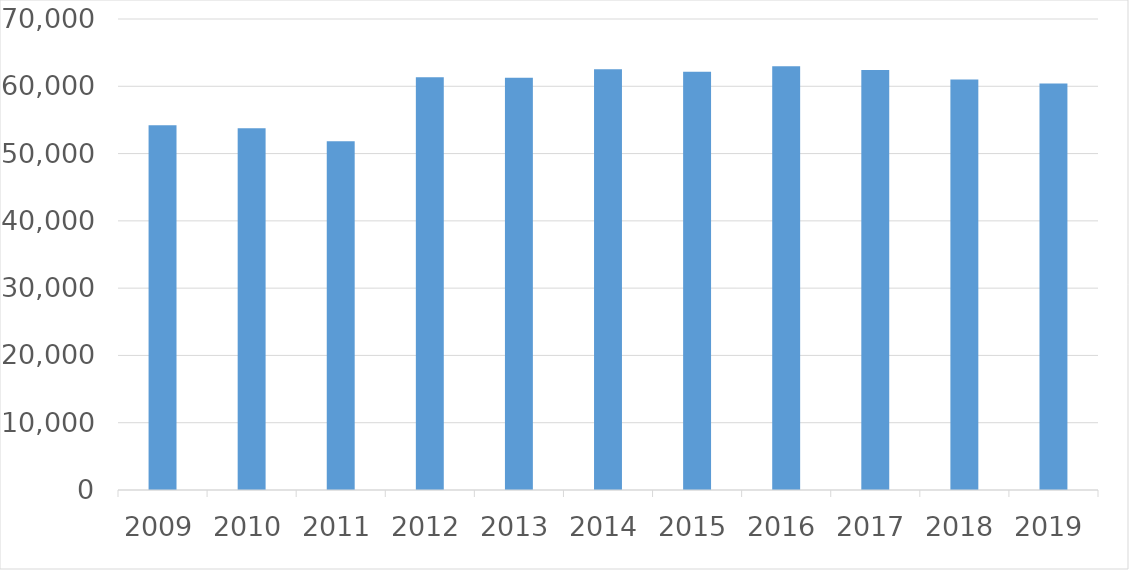
| Category | Series 0 |
|---|---|
| 2009 | 54194 |
| 2010 | 53747 |
| 2011 | 51832 |
| 2012 | 61331 |
| 2013 | 61259 |
| 2014 | 62521 |
| 2015 | 62157 |
| 2016 | 62969 |
| 2017 | 62402 |
| 2018 | 61014 |
| 2019 | 60424 |